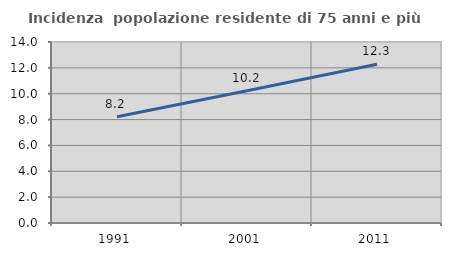
| Category | Incidenza  popolazione residente di 75 anni e più |
|---|---|
| 1991.0 | 8.216 |
| 2001.0 | 10.234 |
| 2011.0 | 12.281 |